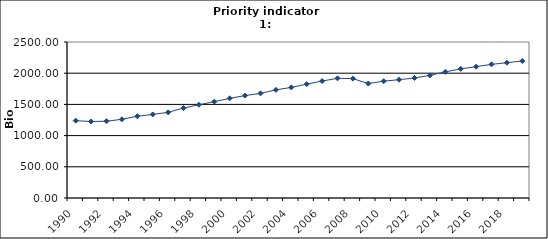
| Category | GDP, Bio Euro (EC95) |
|---|---|
| 1990 | 1239.333 |
| 1991 | 1225.662 |
| 1992 | 1230.578 |
| 1993 | 1261.217 |
| 1994 | 1309.723 |
| 1995 | 1339.241 |
| 1996 | 1372.609 |
| 1997 | 1440.901 |
| 1998 | 1494.326 |
| 1999 | 1543.567 |
| 2000 | 1597.688 |
| 2001 | 1641.31 |
| 2002 | 1677.07 |
| 2003 | 1732.78 |
| 2004 | 1772.396 |
| 2005 | 1824.783 |
| 2006 | 1873.939 |
| 2007 | 1918.175 |
| 2008 | 1912.827 |
| 2009 | 1834.135 |
| 2010 | 1872.176 |
| 2011 | 1896.059 |
| 2012 | 1923.18 |
| 2013 | 1965.223 |
| 2014 | 2021.482 |
| 2015 | 2069.251 |
| 2016 | 2104.892 |
| 2017 | 2141.523 |
| 2018 | 2168.348 |
| 2019 | 2195.688 |